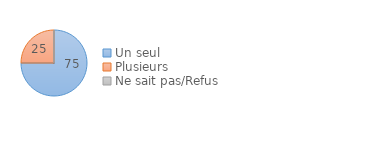
| Category | Series 0 |
|---|---|
| Un seul | 75 |
| Plusieurs  | 25 |
| Ne sait pas/Refus | 0 |